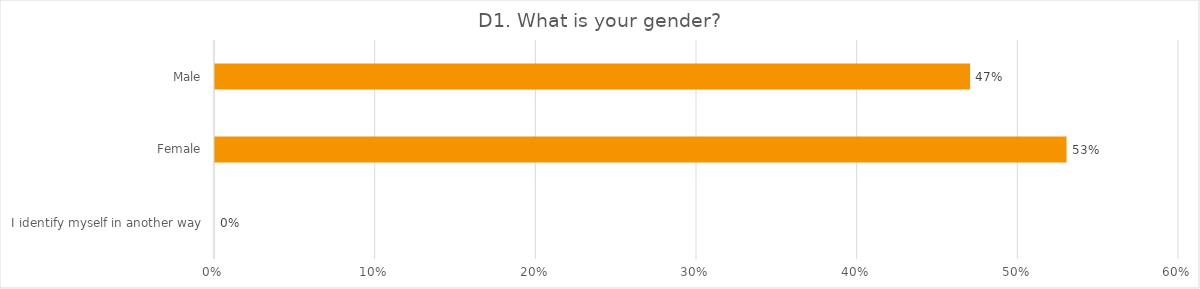
| Category | D1. What is your gender? |
|---|---|
| I identify myself in another way | 0 |
| Female | 0.53 |
| Male | 0.47 |